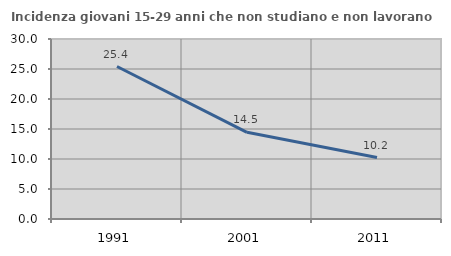
| Category | Incidenza giovani 15-29 anni che non studiano e non lavorano  |
|---|---|
| 1991.0 | 25.414 |
| 2001.0 | 14.452 |
| 2011.0 | 10.243 |